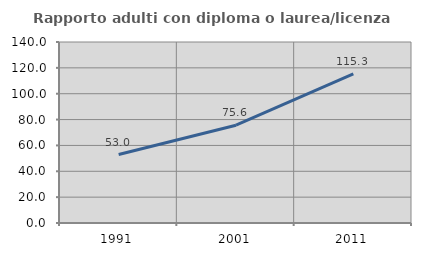
| Category | Rapporto adulti con diploma o laurea/licenza media  |
|---|---|
| 1991.0 | 52.972 |
| 2001.0 | 75.641 |
| 2011.0 | 115.325 |